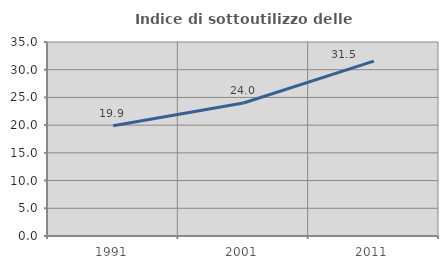
| Category | Indice di sottoutilizzo delle abitazioni  |
|---|---|
| 1991.0 | 19.895 |
| 2001.0 | 23.994 |
| 2011.0 | 31.543 |